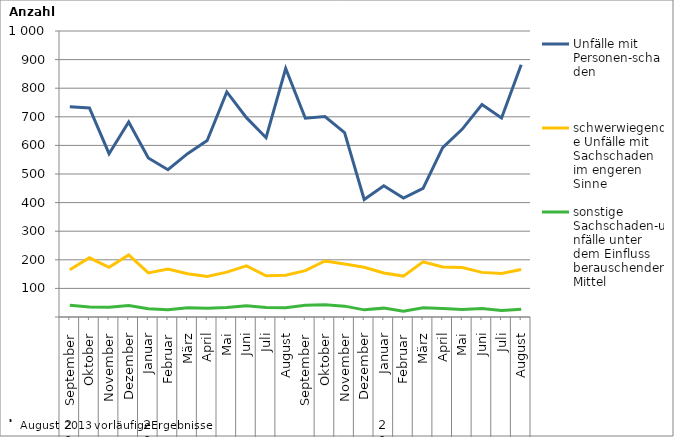
| Category | Unfälle mit Personen-schaden | schwerwiegende Unfälle mit Sachschaden   im engeren Sinne | sonstige Sachschaden-unfälle unter dem Einfluss berauschender Mittel |
|---|---|---|---|
| 0 | 735 | 165 | 41 |
| 1 | 731 | 207 | 35 |
| 2 | 571 | 174 | 34 |
| 3 | 682 | 217 | 40 |
| 4 | 556 | 154 | 29 |
| 5 | 515 | 168 | 25 |
| 6 | 571 | 151 | 32 |
| 7 | 617 | 142 | 31 |
| 8 | 787 | 157 | 33 |
| 9 | 697 | 179 | 39 |
| 10 | 627 | 144 | 33 |
| 11 | 869 | 146 | 32 |
| 12 | 695 | 162 | 41 |
| 13 | 701 | 196 | 43 |
| 14 | 645 | 185 | 38 |
| 15 | 411 | 174 | 25 |
| 16 | 459 | 154 | 31 |
| 17 | 416 | 143 | 20 |
| 18 | 450 | 193 | 32 |
| 19 | 592 | 175 | 30 |
| 20 | 657 | 173 | 26 |
| 21 | 743 | 156 | 30 |
| 22 | 696 | 152 | 23 |
| 23 | 882 | 166 | 27 |